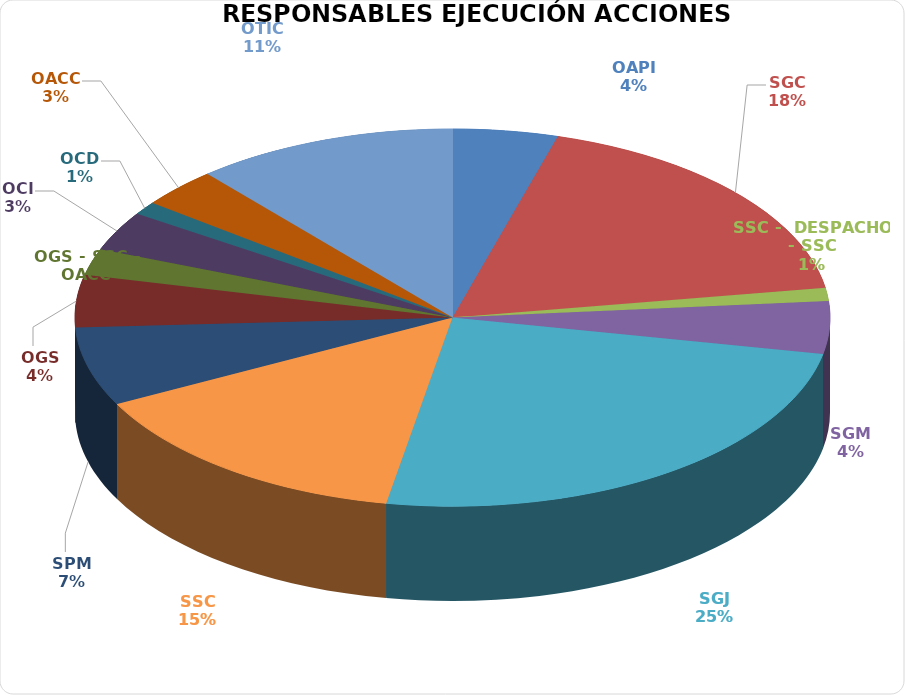
| Category | Series 0 |
|---|---|
| OAPI | 4 |
| SGC | 16 |
| SSC -  DESPACHO - SSC | 1 |
| SGM | 4 |
| SGJ | 22 |
| SSC | 13 |
| SPM | 6 |
| OGS | 4 |
| OGS - SSC - OACC | 2 |
| OCI | 3 |
| OCD | 1 |
| OACC | 3 |
| OTIC | 10 |